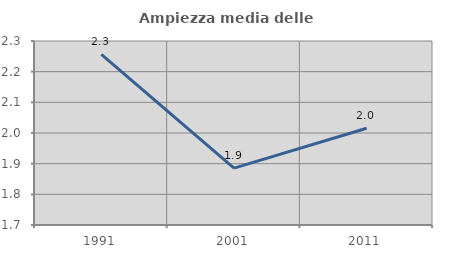
| Category | Ampiezza media delle famiglie |
|---|---|
| 1991.0 | 2.256 |
| 2001.0 | 1.885 |
| 2011.0 | 2.016 |